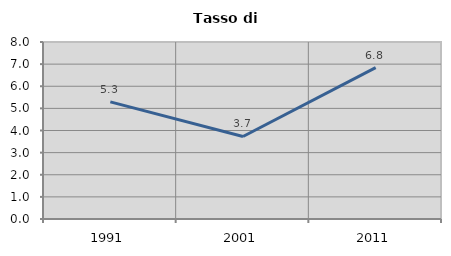
| Category | Tasso di disoccupazione   |
|---|---|
| 1991.0 | 5.295 |
| 2001.0 | 3.73 |
| 2011.0 | 6.841 |